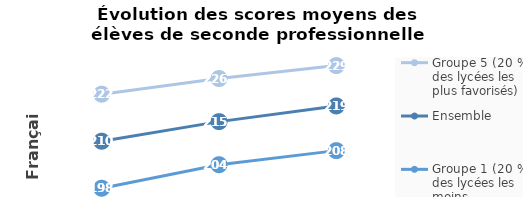
| Category | Groupe 5 (20 % des lycées les plus favorisés) | Ensemble | Groupe 1 (20 % des lycées les moins favorisés) |
|---|---|---|---|
| 2019.0 | 222 | 210 | 198 |
| 2020.0 | 226 | 215 | 204 |
| 2021.0 | 229.3 | 219 | 207.6 |